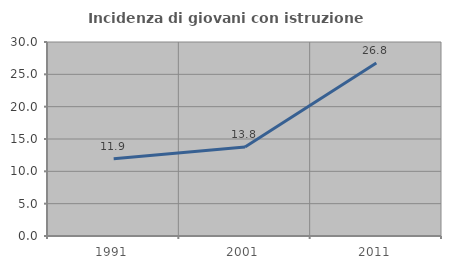
| Category | Incidenza di giovani con istruzione universitaria |
|---|---|
| 1991.0 | 11.94 |
| 2001.0 | 13.75 |
| 2011.0 | 26.761 |